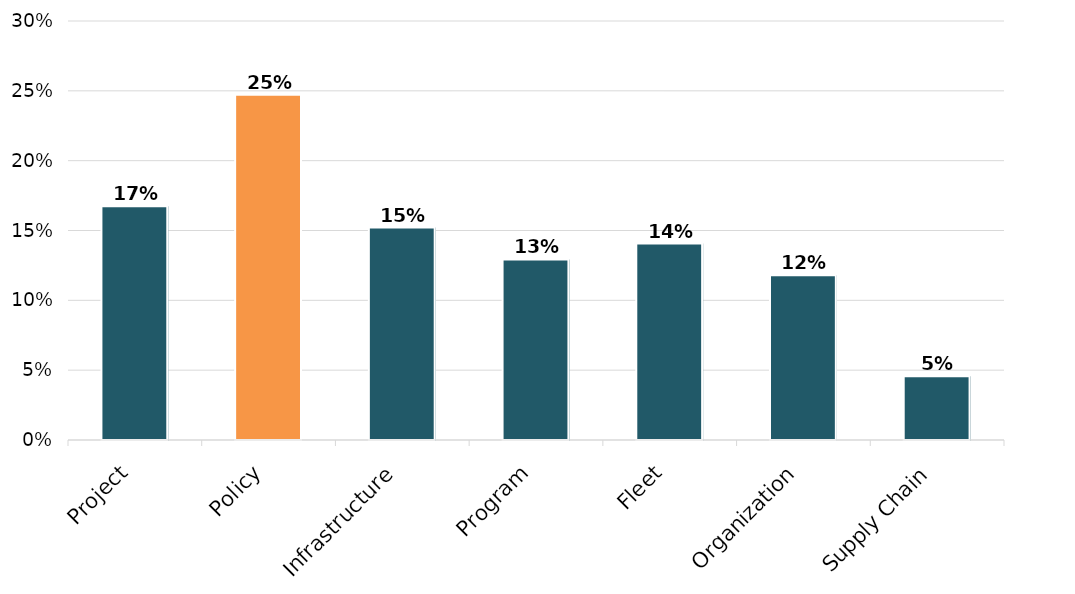
| Category | Avoid | Shift | Improve |
|---|---|---|---|
| NDC (Mitigation Strategies) | 0.081 | 0.29 | 0.629 |
| Tools and Methodologies | 0.201 | 0.287 | 0.511 |